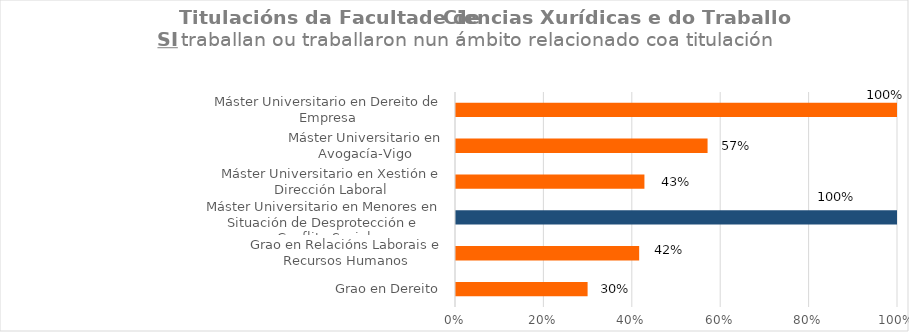
| Category | Series 1 |
|---|---|
| Grao en Dereito | 0.3 |
| Grao en Relacións Laborais e Recursos Humanos | 0.417 |
| Máster Universitario en Menores en Situación de Desprotección e Conflito Social | 1 |
| Máster Universitario en Xestión e Dirección Laboral | 0.429 |
| Máster Universitario en Avogacía-Vigo | 0.571 |
| Máster Universitario en Dereito de Empresa | 1 |